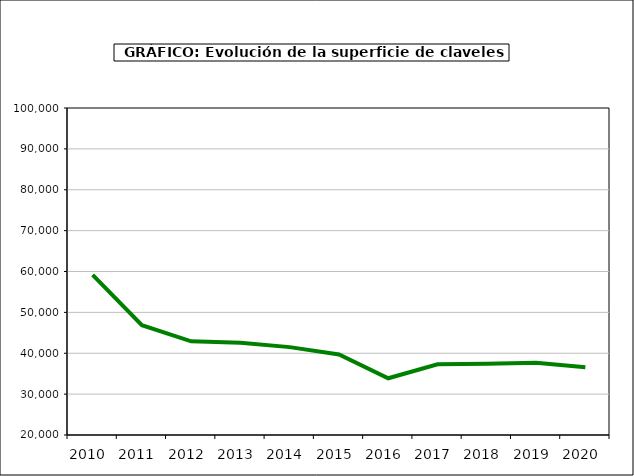
| Category | superficie |
|---|---|
| 2010.0 | 59199 |
| 2011.0 | 46860 |
| 2012.0 | 42920 |
| 2013.0 | 42572 |
| 2014.0 | 41501 |
| 2015.0 | 39713 |
| 2016.0 | 33880 |
| 2017.0 | 37286 |
| 2018.0 | 37444 |
| 2019.0 | 37654 |
| 2020.0 | 36554 |